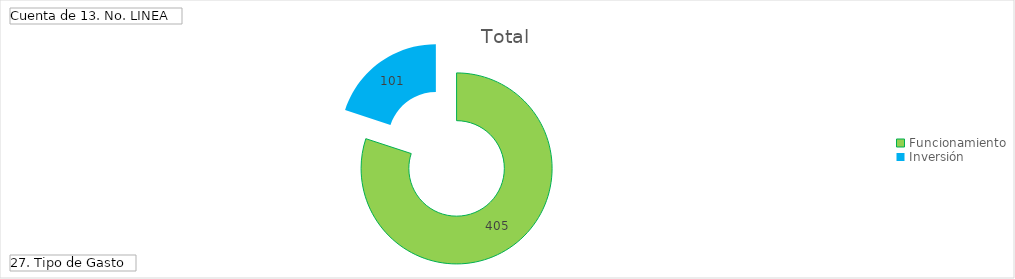
| Category | Total |
|---|---|
| Funcionamiento | 405 |
| Inversión | 101 |